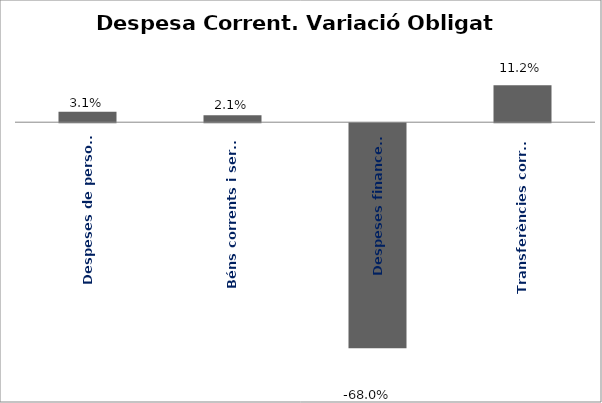
| Category | Series 0 |
|---|---|
| Despeses de personal | 0.031 |
| Béns corrents i serveis | 0.021 |
| Despeses financeres | -0.68 |
| Transferències corrents | 0.112 |